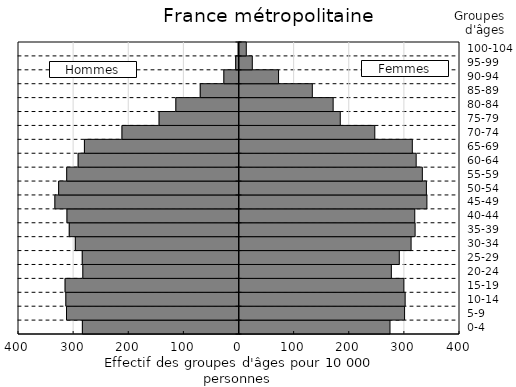
| Category | Series 0 | Series 1 |
|---|---|---|
| 0-4 | -284.114 | 273.019 |
| 5-9 | -312.907 | 299.464 |
| 10-14 | -314.116 | 300.507 |
| 15-19 | -315.497 | 298.163 |
| 20-24 | -283.284 | 275.482 |
| 25-29 | -284.328 | 289.881 |
| 30-34 | -296.914 | 311.296 |
| 35-39 | -307.913 | 318.572 |
| 40-44 | -312.077 | 317.949 |
| 45-49 | -333.997 | 339.984 |
| 50-54 | -327.206 | 339.036 |
| 55-59 | -312.555 | 331.698 |
| 60-64 | -291.788 | 320.498 |
| 65-69 | -280.411 | 313.493 |
| 70-74 | -212.328 | 245.461 |
| 75-79 | -144.983 | 182.815 |
| 80-84 | -114.542 | 169.888 |
| 85-89 | -70.313 | 132.103 |
| 90-94 | -27.473 | 70.854 |
| 95-99 | -6.014 | 23.216 |
| 100-104 | -1.54 | 12.321 |